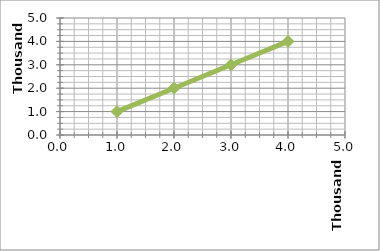
| Category | Series 1 |
|---|---|
| 1000.0 | 1000 |
| 2000.0 | 2000 |
| 3000.0 | 3000 |
| 4000.0 | 4000 |